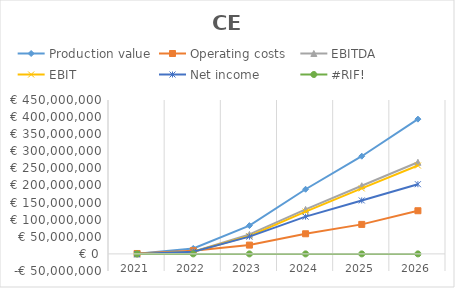
| Category | Production value | Operating costs | EBITDA | EBIT | Net income | #RIF! |
|---|---|---|---|---|---|---|
| 2021.0 | 618333.333 | 1171501.536 | -553168.203 | -613063.639 | -613063.639 |  |
| 2022.0 | 15868382.26 | 9421829.147 | 6446553.113 | 6106333.747 | 6277957.693 |  |
| 2023.0 | 82763830.721 | 25722411.738 | 57041418.984 | 52182134.564 | 50393188.195 |  |
| 2024.0 | 189014250.595 | 58828104.151 | 130186146.444 | 123765954.963 | 108880472.625 |  |
| 2025.0 | 285641648.761 | 86276648.982 | 199364999.779 | 191542275.238 | 156329258.76 |  |
| 2026.0 | 394048244.625 | 126170405.563 | 267877839.062 | 258393989.01 | 203785427.768 |  |